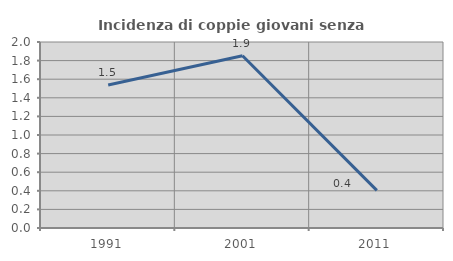
| Category | Incidenza di coppie giovani senza figli |
|---|---|
| 1991.0 | 1.538 |
| 2001.0 | 1.852 |
| 2011.0 | 0.405 |